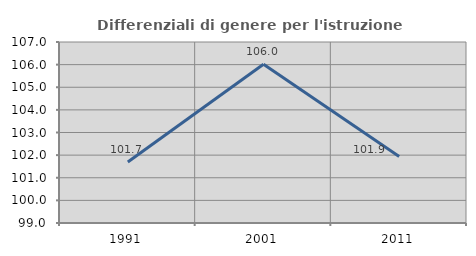
| Category | Differenziali di genere per l'istruzione superiore |
|---|---|
| 1991.0 | 101.695 |
| 2001.0 | 106.016 |
| 2011.0 | 101.941 |